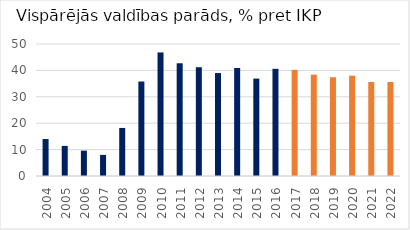
| Category | Latvia |
|---|---|
| 2004 | 14 |
| 2005 | 11.4 |
| 2006 | 9.6 |
| 2007 | 8 |
| 2008 | 18.2 |
| 2009 | 35.8 |
| 2010 | 46.8 |
| 2011 | 42.7 |
| 2012 | 41.2 |
| 2013 | 39 |
| 2014 | 40.9 |
| 2015 | 36.9 |
| 2016 | 40.6 |
| 2017 | 40.2 |
| 2018 | 38.4 |
| 2019 | 37.4 |
| 2020 | 38 |
| 2021 | 35.6 |
| 2022 | 35.6 |